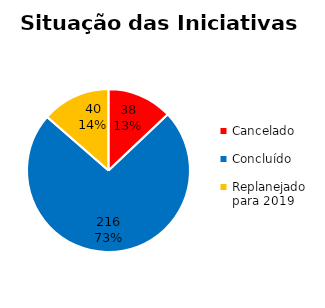
| Category | Total |
|---|---|
| Cancelado | 38 |
| Concluído | 216 |
| Replanejado para 2019 | 40 |